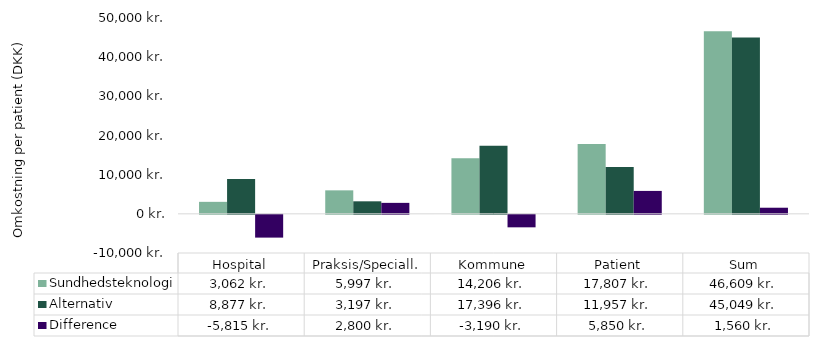
| Category | Sundhedsteknologi | Alternativ  | Difference |
|---|---|---|---|
| Hospital | 3061.667 | 8876.513 | -5814.847 |
| Praksis/Speciall. | 5997.46 | 3197.46 | 2800 |
| Kommune | 14205.72 | 17395.75 | -3190.03 |
| Patient | 17807 | 11957 | 5850 |
| Sum | 46608.881 | 45049.223 | 1559.658 |